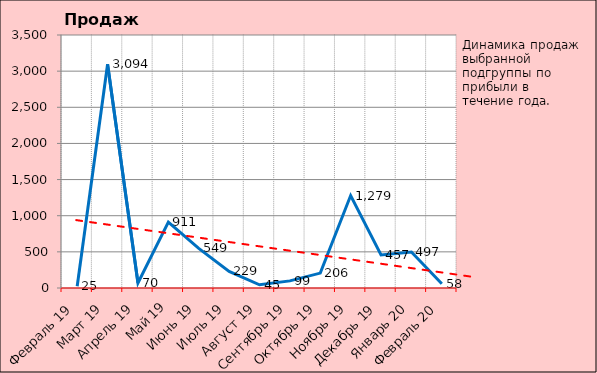
| Category | Прибыль в теч. года |
|---|---|
|   Февраль 19 | 25 |
|   Март 19 | 3094.28 |
|   Апрель 19 | 69.72 |
|   Май 19 | 911 |
|   Июнь 19 | 548.85 |
|   Июль 19 | 229 |
|   Август 19 | 44.64 |
|   Сентябрь 19 | 98.58 |
|   Октябрь 19 | 206.21 |
|   Ноябрь 19 | 1278.75 |
|   Декабрь 19 | 456.55 |
|   Январь 20 | 496.85 |
|   Февраль 20 | 57.65 |